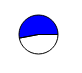
| Category | Series 0 |
|---|---|
| 0 | 8805837 |
| 1 | 9915503 |